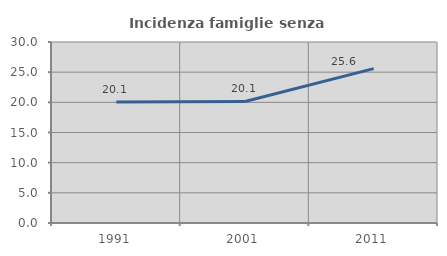
| Category | Incidenza famiglie senza nuclei |
|---|---|
| 1991.0 | 20.068 |
| 2001.0 | 20.144 |
| 2011.0 | 25.587 |